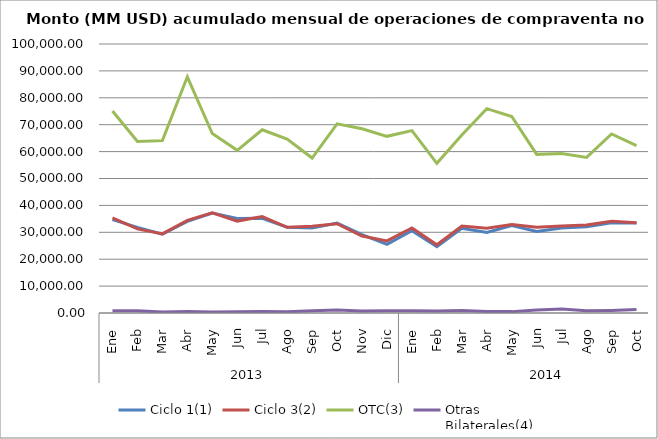
| Category | Ciclo 1(1) | Ciclo 3(2) | OTC(3) | Otras
Bilaterales(4) |
|---|---|---|---|---|
| 0 | 34736.674 | 35336.778 | 75100.994 | 862.558 |
| 1 | 31837.301 | 31276.084 | 63735.014 | 835.426 |
| 2 | 29308.645 | 29417.861 | 64070.642 | 371.583 |
| 3 | 34083.554 | 34428.23 | 87796.406 | 540.738 |
| 4 | 37163.38 | 37242.543 | 66687.424 | 368.797 |
| 5 | 35163.266 | 34165.361 | 60467.987 | 473.52 |
| 6 | 35197.057 | 35828.881 | 68121.887 | 537.978 |
| 7 | 31913.776 | 31846.832 | 64630.867 | 477.656 |
| 8 | 31601.855 | 32260.646 | 57599.123 | 864.94 |
| 9 | 33455.872 | 33201.092 | 70316.044 | 1074.052 |
| 10 | 29141.89 | 28620.849 | 68482.193 | 758.559 |
| 11 | 25532.796 | 26816.016 | 65678.317 | 842.072 |
| 12 | 30609.998 | 31608.391 | 67807.808 | 838.473 |
| 13 | 24661.445 | 25355.64 | 55646.165 | 717.558 |
| 14 | 31490.456 | 32327.003 | 66188.016 | 905.778 |
| 15 | 29968.466 | 31511.409 | 75953.393 | 552.114 |
| 16 | 32511.8 | 32893.552 | 73041.006 | 512.251 |
| 17 | 30347.815 | 31837.962 | 58974.75 | 1157.814 |
| 18 | 31634.299 | 32380.251 | 59280.214 | 1471.651 |
| 19 | 32084.514 | 32686.117 | 57820.266 | 827.326 |
| 20 | 33552.254 | 34123.345 | 66553.88 | 951.31 |
| 21 | 33462.158 | 33540.142 | 62195.497 | 1269.478 |